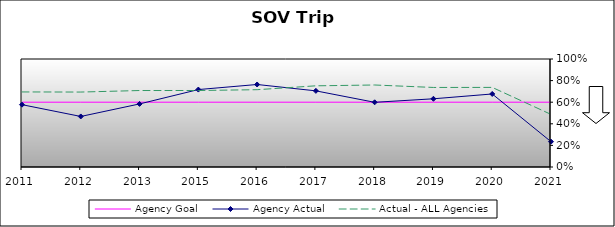
| Category | Agency Goal | Agency Actual | Actual - ALL Agencies |
|---|---|---|---|
| 2011.0 | 0.6 | 0.577 | 0.695 |
| 2012.0 | 0.6 | 0.468 | 0.694 |
| 2013.0 | 0.6 | 0.584 | 0.708 |
| 2015.0 | 0.6 | 0.717 | 0.708 |
| 2016.0 | 0.6 | 0.764 | 0.716 |
| 2017.0 | 0.6 | 0.705 | 0.752 |
| 2018.0 | 0.6 | 0.599 | 0.759 |
| 2019.0 | 0.6 | 0.632 | 0.736 |
| 2020.0 | 0.6 | 0.676 | 0.737 |
| 2021.0 | 0.6 | 0.235 | 0.487 |